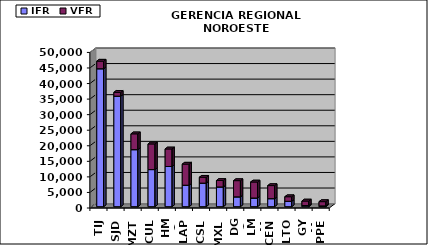
| Category | IFR | VFR |
|---|---|---|
| TIJ | 44333 | 2430 |
| SJD | 35514 | 1219 |
| MZT | 18332 | 5082 |
| CUL | 11926 | 8240 |
| HMO | 12914 | 5637 |
| LAP | 6896 | 6775 |
| CSL | 7569 | 1890 |
| MXL | 6342 | 2073 |
| DGO | 3159 | 5208 |
| LMM | 2780 | 5150 |
| CEN | 2577 | 4201 |
| LTO | 1731 | 1471 |
| GYM | 366 | 1451 |
| PPE | 249 | 1373 |